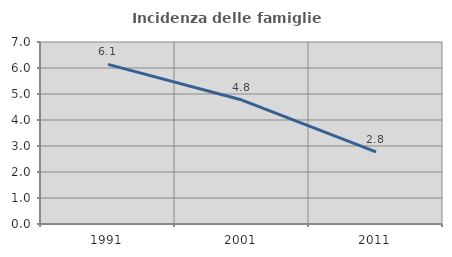
| Category | Incidenza delle famiglie numerose |
|---|---|
| 1991.0 | 6.141 |
| 2001.0 | 4.766 |
| 2011.0 | 2.773 |